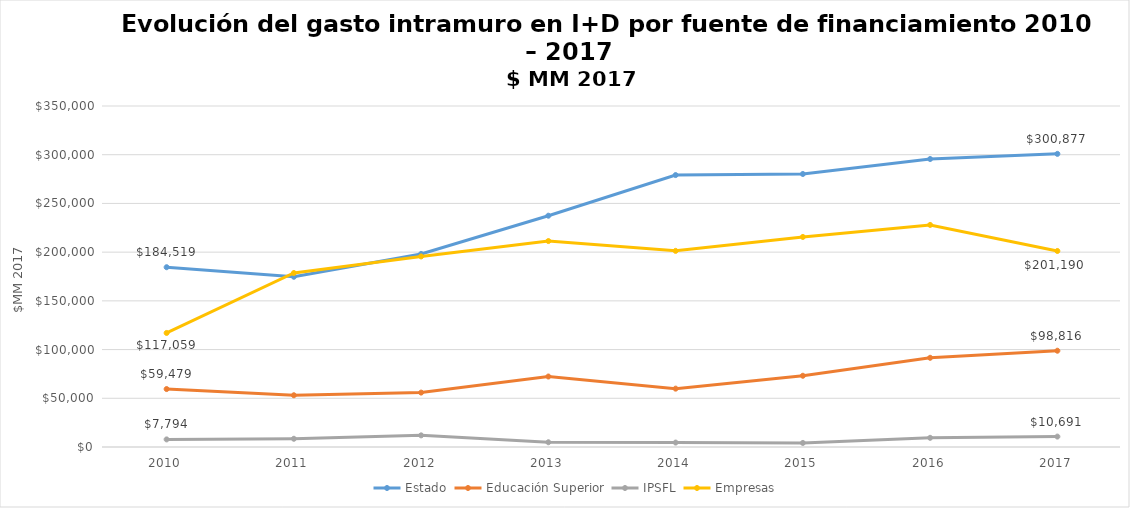
| Category | Estado | Educación Superior | IPSFL | Empresas |
|---|---|---|---|---|
| 2010.0 | 184519.375 | 59479.374 | 7794.071 | 117058.9 |
| 2011.0 | 174727.788 | 53104.19 | 8443.005 | 178579.954 |
| 2012.0 | 198172.597 | 55839.246 | 11944.709 | 195586.156 |
| 2013.0 | 237401.74 | 72338.024 | 4853.582 | 211379.838 |
| 2014.0 | 279101.867 | 59901.374 | 4547.721 | 201318.73 |
| 2015.0 | 280209.603 | 73125.356 | 4155.732 | 215607.468 |
| 2016.0 | 295588.091 | 91561.229 | 9414.382 | 227941.487 |
| 2017.0 | 300876.753 | 98816.028 | 10691.138 | 201190.482 |